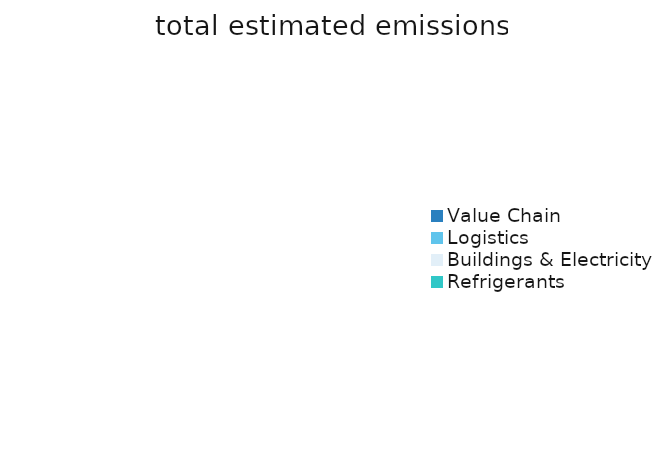
| Category | 0 |
|---|---|
| Value Chain | 0 |
| Logistics | 0 |
| Buildings & Electricity | 0 |
| Refrigerants | 0 |